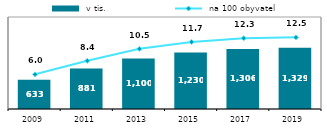
| Category |  v tis. |
|---|---|
| 2009.0 | 633.326 |
| 2011.0 | 880.889 |
| 2013.0 | 1099.9 |
| 2015.0 | 1230.33 |
| 2017.0 | 1305.762 |
| 2019.0 | 1329.289 |